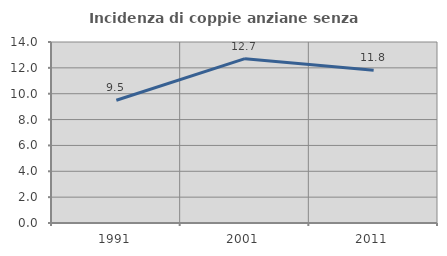
| Category | Incidenza di coppie anziane senza figli  |
|---|---|
| 1991.0 | 9.491 |
| 2001.0 | 12.71 |
| 2011.0 | 11.807 |